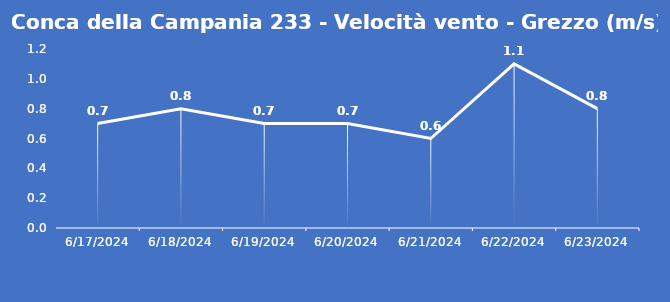
| Category | Conca della Campania 233 - Velocità vento - Grezzo (m/s) |
|---|---|
| 6/17/24 | 0.7 |
| 6/18/24 | 0.8 |
| 6/19/24 | 0.7 |
| 6/20/24 | 0.7 |
| 6/21/24 | 0.6 |
| 6/22/24 | 1.1 |
| 6/23/24 | 0.8 |